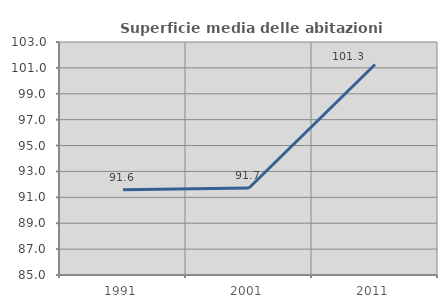
| Category | Superficie media delle abitazioni occupate |
|---|---|
| 1991.0 | 91.585 |
| 2001.0 | 91.721 |
| 2011.0 | 101.26 |